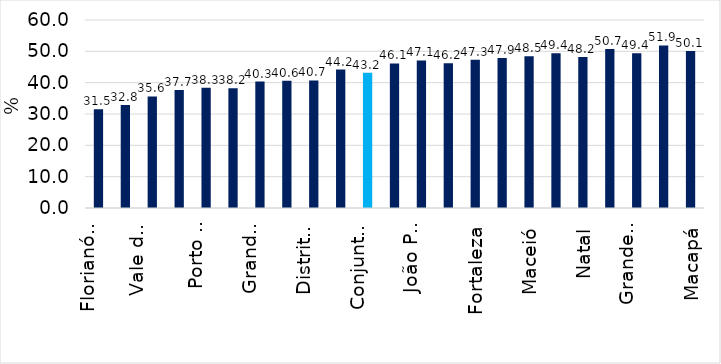
| Category | Series 0 |
|---|---|
| Florianópolis | 31.485 |
| Curitiba | 32.835 |
| Vale do Rio Cuiabá | 35.587 |
| Goiânia | 37.668 |
| Porto Alegre | 38.343 |
| São Paulo | 38.244 |
| Grande Vitória | 40.347 |
| Belo Horizonte | 40.593 |
| Distrito Federal | 40.697 |
| Belém | 44.171 |
| Conjunto RMs | 43.159 |
| Rio de Janeiro | 46.124 |
| João Pessoa | 47.101 |
| Teresina | 46.203 |
| Fortaleza | 47.318 |
| Manaus | 47.892 |
| Maceió | 48.456 |
| Recife | 49.373 |
| Natal | 48.226 |
| Salvador | 50.712 |
| Grande São Luís | 49.389 |
| Aracaju | 51.896 |
| Macapá | 50.133 |